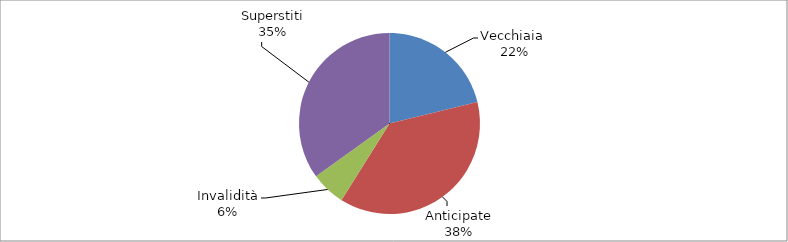
| Category | Series 0 |
|---|---|
| Vecchiaia  | 18533 |
| Anticipate | 33007 |
| Invalidità | 5385 |
| Superstiti | 30547 |